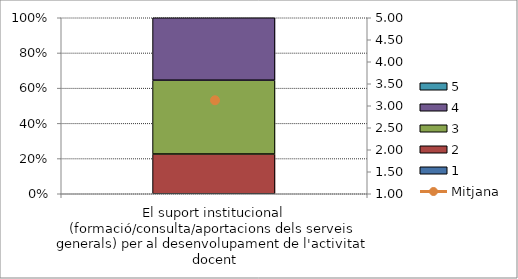
| Category | 1 | 2 | 3 | 4 | 5 |
|---|---|---|---|---|---|
| El suport institucional (formació/consulta/aportacions dels serveis generals) per al desenvolupament de l'activitat docent | 0 | 7 | 13 | 11 | 0 |